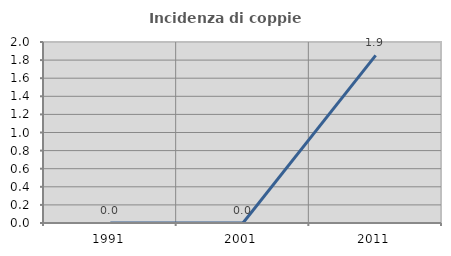
| Category | Incidenza di coppie miste |
|---|---|
| 1991.0 | 0 |
| 2001.0 | 0 |
| 2011.0 | 1.852 |